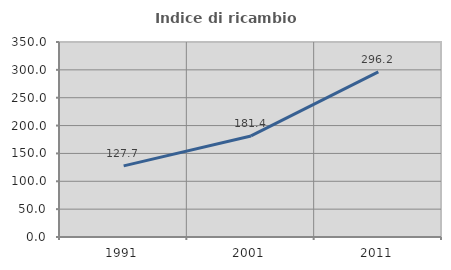
| Category | Indice di ricambio occupazionale  |
|---|---|
| 1991.0 | 127.66 |
| 2001.0 | 181.429 |
| 2011.0 | 296.226 |